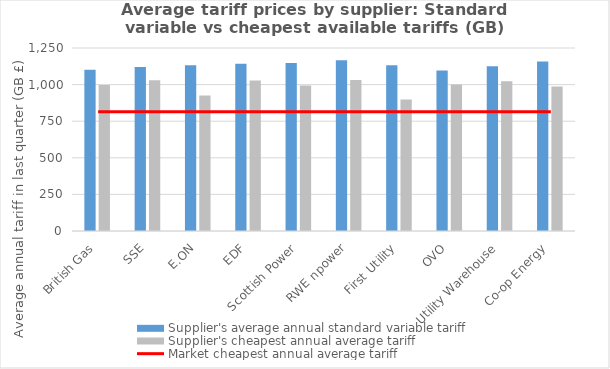
| Category | Supplier's average annual standard variable tariff | Supplier's cheapest annual average tariff |
|---|---|---|
| British Gas | 1101 | 998 |
| SSE | 1121 | 1029 |
| E.ON | 1133 | 926 |
| EDF | 1142 | 1028 |
| Scottish Power | 1147 | 994 |
| RWE npower | 1166 | 1032 |
| First Utility | 1132 | 898 |
| OVO | 1097 | 1000 |
| Utility Warehouse | 1125 | 1023 |
| Co-op Energy | 1158 | 987 |